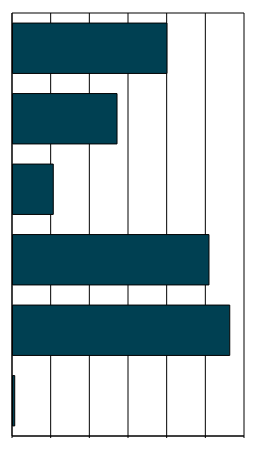
| Category | Series 0 |
|---|---|
| 0 | 0.891 |
| 1 | 112.119 |
| 2 | 101.366 |
| 3 | 20.831 |
| 4 | 53.806 |
| 5 | 79.643 |